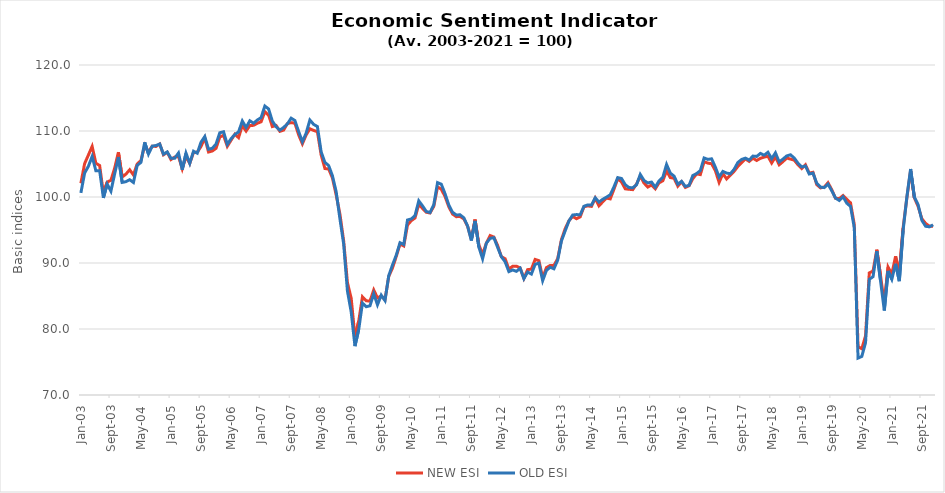
| Category | NEW ESI | OLD ESI |
|---|---|---|
| 2003-01-01 | 102.078 | 100.617 |
| 2003-02-01 | 105.061 | 103.637 |
| 2003-03-01 | 106.356 | 104.652 |
| 2003-04-01 | 107.667 | 106.143 |
| 2003-05-01 | 105.115 | 103.968 |
| 2003-06-01 | 104.768 | 103.991 |
| 2003-07-01 | 100.536 | 99.864 |
| 2003-08-01 | 102.263 | 101.954 |
| 2003-09-01 | 102.525 | 100.878 |
| 2003-10-01 | 104.375 | 103.507 |
| 2003-11-01 | 106.796 | 106.058 |
| 2003-12-01 | 103.026 | 102.208 |
| 2004-01-01 | 103.465 | 102.323 |
| 2004-02-01 | 104.128 | 102.615 |
| 2004-03-01 | 103.342 | 102.2 |
| 2004-04-01 | 105.007 | 104.783 |
| 2004-05-01 | 105.524 | 105.251 |
| 2004-06-01 | 107.821 | 108.28 |
| 2004-07-01 | 106.827 | 106.504 |
| 2004-08-01 | 107.705 | 107.703 |
| 2004-09-01 | 107.659 | 107.795 |
| 2004-10-01 | 108.029 | 108.026 |
| 2004-11-01 | 106.395 | 106.489 |
| 2004-12-01 | 106.78 | 106.827 |
| 2005-01-01 | 105.678 | 105.866 |
| 2005-02-01 | 106.056 | 105.874 |
| 2005-03-01 | 106.156 | 106.666 |
| 2005-04-01 | 104.267 | 104.137 |
| 2005-05-01 | 106.133 | 106.643 |
| 2005-06-01 | 105.092 | 105.098 |
| 2005-07-01 | 106.75 | 106.935 |
| 2005-08-01 | 106.773 | 106.635 |
| 2005-09-01 | 107.659 | 108.303 |
| 2005-10-01 | 108.939 | 109.163 |
| 2005-11-01 | 106.819 | 107.234 |
| 2005-12-01 | 106.965 | 107.38 |
| 2006-01-01 | 107.374 | 108.018 |
| 2006-02-01 | 109.093 | 109.732 |
| 2006-03-01 | 109.34 | 109.886 |
| 2006-04-01 | 107.682 | 107.957 |
| 2006-05-01 | 108.6 | 108.825 |
| 2006-06-01 | 109.509 | 109.456 |
| 2006-07-01 | 108.993 | 109.863 |
| 2006-08-01 | 110.835 | 111.515 |
| 2006-09-01 | 109.987 | 110.532 |
| 2006-10-01 | 110.82 | 111.546 |
| 2006-11-01 | 110.859 | 111.17 |
| 2006-12-01 | 111.175 | 111.669 |
| 2007-01-01 | 111.39 | 112.023 |
| 2007-02-01 | 112.925 | 113.783 |
| 2007-03-01 | 112.393 | 113.345 |
| 2007-04-01 | 110.674 | 111.492 |
| 2007-05-01 | 110.835 | 110.639 |
| 2007-06-01 | 109.949 | 110.124 |
| 2007-07-01 | 110.134 | 110.539 |
| 2007-08-01 | 111.128 | 111.07 |
| 2007-09-01 | 111.267 | 111.946 |
| 2007-10-01 | 111.19 | 111.592 |
| 2007-11-01 | 109.417 | 109.917 |
| 2007-12-01 | 108.06 | 108.38 |
| 2008-01-01 | 109.401 | 109.671 |
| 2008-02-01 | 110.334 | 111.661 |
| 2008-03-01 | 110.088 | 111 |
| 2008-04-01 | 109.903 | 110.678 |
| 2008-05-01 | 106.372 | 106.835 |
| 2008-06-01 | 104.313 | 105.244 |
| 2008-07-01 | 104.244 | 104.759 |
| 2008-08-01 | 102.887 | 103.222 |
| 2008-09-01 | 100.312 | 100.793 |
| 2008-10-01 | 97.406 | 96.697 |
| 2008-11-01 | 93.328 | 92.862 |
| 2008-12-01 | 87.022 | 85.744 |
| 2009-01-01 | 84.647 | 82.584 |
| 2009-02-01 | 78.842 | 77.405 |
| 2009-03-01 | 81.178 | 79.909 |
| 2009-04-01 | 84.871 | 83.923 |
| 2009-05-01 | 84.277 | 83.377 |
| 2009-06-01 | 84.231 | 83.515 |
| 2009-07-01 | 85.919 | 85.337 |
| 2009-08-01 | 84.717 | 83.668 |
| 2009-09-01 | 85.017 | 85.13 |
| 2009-10-01 | 84.431 | 84.306 |
| 2009-11-01 | 87.97 | 88.073 |
| 2009-12-01 | 89.242 | 89.701 |
| 2010-01-01 | 90.992 | 91.178 |
| 2010-02-01 | 92.858 | 93.075 |
| 2010-03-01 | 92.58 | 92.808 |
| 2010-04-01 | 95.756 | 96.519 |
| 2010-05-01 | 96.411 | 96.674 |
| 2010-06-01 | 96.822 | 97.175 |
| 2010-07-01 | 98.898 | 99.421 |
| 2010-08-01 | 98.269 | 98.655 |
| 2010-09-01 | 97.691 | 97.802 |
| 2010-10-01 | 97.576 | 97.65 |
| 2010-11-01 | 98.584 | 98.831 |
| 2010-12-01 | 101.526 | 102.179 |
| 2011-01-01 | 101.193 | 101.939 |
| 2011-02-01 | 100.059 | 100.495 |
| 2011-03-01 | 98.528 | 98.784 |
| 2011-04-01 | 97.418 | 97.678 |
| 2011-05-01 | 97.02 | 97.281 |
| 2011-06-01 | 97.048 | 97.299 |
| 2011-07-01 | 96.687 | 96.848 |
| 2011-08-01 | 95.582 | 95.616 |
| 2011-09-01 | 93.588 | 93.398 |
| 2011-10-01 | 96.581 | 96.373 |
| 2011-11-01 | 92.733 | 92.407 |
| 2011-12-01 | 91.34 | 90.64 |
| 2012-01-01 | 93.015 | 93.001 |
| 2012-02-01 | 94.157 | 93.735 |
| 2012-03-01 | 93.935 | 93.836 |
| 2012-04-01 | 92.668 | 92.379 |
| 2012-05-01 | 90.947 | 90.949 |
| 2012-06-01 | 90.651 | 90.184 |
| 2012-07-01 | 89.065 | 88.694 |
| 2012-08-01 | 89.504 | 88.948 |
| 2012-09-01 | 89.523 | 88.736 |
| 2012-10-01 | 89.24 | 89.202 |
| 2012-11-01 | 87.668 | 87.624 |
| 2012-12-01 | 88.995 | 88.634 |
| 2013-01-01 | 89.065 | 88.325 |
| 2013-02-01 | 90.545 | 89.801 |
| 2013-03-01 | 90.355 | 89.981 |
| 2013-04-01 | 87.779 | 87.32 |
| 2013-05-01 | 89.296 | 88.879 |
| 2013-06-01 | 89.629 | 89.358 |
| 2013-07-01 | 89.624 | 89.123 |
| 2013-08-01 | 90.656 | 90.428 |
| 2013-09-01 | 93.542 | 93.343 |
| 2013-10-01 | 95.207 | 94.874 |
| 2013-11-01 | 96.401 | 96.377 |
| 2013-12-01 | 97.058 | 97.272 |
| 2014-01-01 | 96.715 | 97.336 |
| 2014-02-01 | 97.002 | 97.309 |
| 2014-03-01 | 98.524 | 98.595 |
| 2014-04-01 | 98.649 | 98.803 |
| 2014-05-01 | 98.575 | 98.784 |
| 2014-06-01 | 99.824 | 99.882 |
| 2014-07-01 | 98.663 | 99.232 |
| 2014-08-01 | 99.269 | 99.651 |
| 2014-09-01 | 99.828 | 99.979 |
| 2014-10-01 | 99.713 | 100.334 |
| 2014-11-01 | 101.197 | 101.547 |
| 2014-12-01 | 102.779 | 102.939 |
| 2015-01-01 | 102.275 | 102.806 |
| 2015-02-01 | 101.234 | 101.86 |
| 2015-03-01 | 101.17 | 101.427 |
| 2015-04-01 | 101.114 | 101.408 |
| 2015-05-01 | 101.961 | 101.846 |
| 2015-06-01 | 103.172 | 103.414 |
| 2015-07-01 | 102.109 | 102.501 |
| 2015-08-01 | 101.503 | 102.128 |
| 2015-09-01 | 101.831 | 102.262 |
| 2015-10-01 | 101.239 | 101.487 |
| 2015-11-01 | 102.15 | 102.441 |
| 2015-12-01 | 102.455 | 102.976 |
| 2016-01-01 | 103.95 | 104.927 |
| 2016-02-01 | 102.946 | 103.613 |
| 2016-03-01 | 102.83 | 103.165 |
| 2016-04-01 | 101.641 | 101.934 |
| 2016-05-01 | 102.307 | 102.368 |
| 2016-06-01 | 101.447 | 101.602 |
| 2016-07-01 | 101.706 | 101.768 |
| 2016-08-01 | 102.789 | 103.262 |
| 2016-09-01 | 103.492 | 103.548 |
| 2016-10-01 | 103.394 | 104.005 |
| 2016-11-01 | 105.351 | 105.909 |
| 2016-12-01 | 105.134 | 105.702 |
| 2017-01-01 | 105.041 | 105.785 |
| 2017-02-01 | 103.991 | 104.517 |
| 2017-03-01 | 102.215 | 103.022 |
| 2017-04-01 | 103.542 | 103.876 |
| 2017-05-01 | 102.733 | 103.622 |
| 2017-06-01 | 103.325 | 103.53 |
| 2017-07-01 | 103.899 | 104.194 |
| 2017-08-01 | 104.629 | 105.236 |
| 2017-09-01 | 105.217 | 105.693 |
| 2017-10-01 | 105.786 | 105.891 |
| 2017-11-01 | 105.393 | 105.591 |
| 2017-12-01 | 105.874 | 106.2 |
| 2018-01-01 | 105.531 | 106.144 |
| 2018-02-01 | 105.865 | 106.606 |
| 2018-03-01 | 106.045 | 106.334 |
| 2018-04-01 | 106.174 | 106.776 |
| 2018-05-01 | 105.152 | 105.812 |
| 2018-06-01 | 106.087 | 106.689 |
| 2018-07-01 | 104.884 | 105.314 |
| 2018-08-01 | 105.36 | 105.743 |
| 2018-09-01 | 105.897 | 106.223 |
| 2018-10-01 | 105.749 | 106.398 |
| 2018-11-01 | 105.582 | 105.909 |
| 2018-12-01 | 104.884 | 105.13 |
| 2019-01-01 | 104.306 | 104.553 |
| 2019-02-01 | 104.879 | 104.701 |
| 2019-03-01 | 103.607 | 103.488 |
| 2019-04-01 | 103.746 | 103.617 |
| 2019-05-01 | 101.877 | 102.086 |
| 2019-06-01 | 101.382 | 101.501 |
| 2019-07-01 | 101.498 | 101.422 |
| 2019-08-01 | 102.164 | 101.957 |
| 2019-09-01 | 101.109 | 100.943 |
| 2019-10-01 | 99.81 | 99.84 |
| 2019-11-01 | 99.74 | 99.476 |
| 2019-12-01 | 100.217 | 100.053 |
| 2020-01-01 | 99.648 | 99.061 |
| 2020-02-01 | 99.111 | 98.581 |
| 2020-03-01 | 95.832 | 95.349 |
| 2020-04-01 | 77.357 | 75.593 |
| 2020-05-01 | 77.006 | 75.842 |
| 2020-06-01 | 78.953 | 77.931 |
| 2020-07-01 | 88.496 | 87.537 |
| 2020-08-01 | 88.792 | 87.924 |
| 2020-09-01 | 92.02 | 91.789 |
| 2020-10-01 | 88.084 | 87.255 |
| 2020-11-01 | 83.791 | 82.801 |
| 2020-12-01 | 89.379 | 88.787 |
| 2021-01-01 | 88.315 | 87.532 |
| 2021-02-01 | 91.026 | 89.875 |
| 2021-03-01 | 88.44 | 87.251 |
| 2021-04-01 | 95.295 | 94.906 |
| 2021-05-01 | 99.851 | 99.965 |
| 2021-06-01 | 104.005 | 104.244 |
| 2021-07-01 | 99.884 | 99.988 |
| 2021-08-01 | 98.579 | 98.835 |
| 2021-09-01 | 96.706 | 96.46 |
| 2021-10-01 | 96 | 95.57 |
| 2021-11-01 | 95.582 | 95.478 |
| 2021-12-01 | 95.568 | 95.778 |